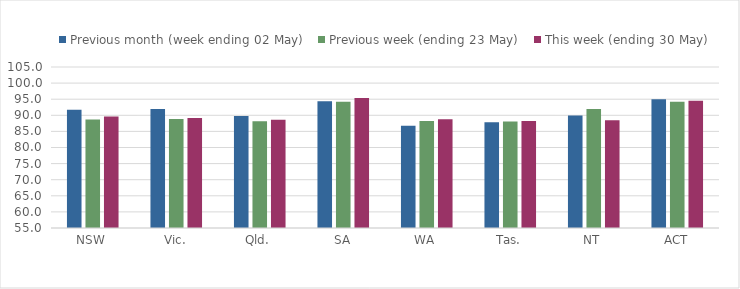
| Category | Previous month (week ending 02 May) | Previous week (ending 23 May) | This week (ending 30 May) |
|---|---|---|---|
| NSW | 91.76 | 88.678 | 89.603 |
| Vic. | 91.983 | 88.877 | 89.182 |
| Qld. | 89.785 | 88.123 | 88.656 |
| SA | 94.393 | 94.198 | 95.407 |
| WA | 86.773 | 88.227 | 88.811 |
| Tas. | 87.847 | 88.111 | 88.256 |
| NT | 89.96 | 91.968 | 88.482 |
| ACT | 95.004 | 94.198 | 94.521 |